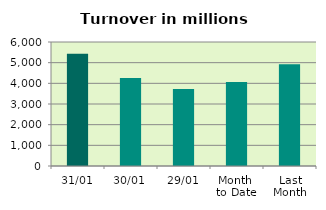
| Category | Series 0 |
|---|---|
| 31/01 | 5427.821 |
| 30/01 | 4257.599 |
| 29/01 | 3725.195 |
| Month 
to Date | 4067.116 |
| Last
Month | 4921.323 |